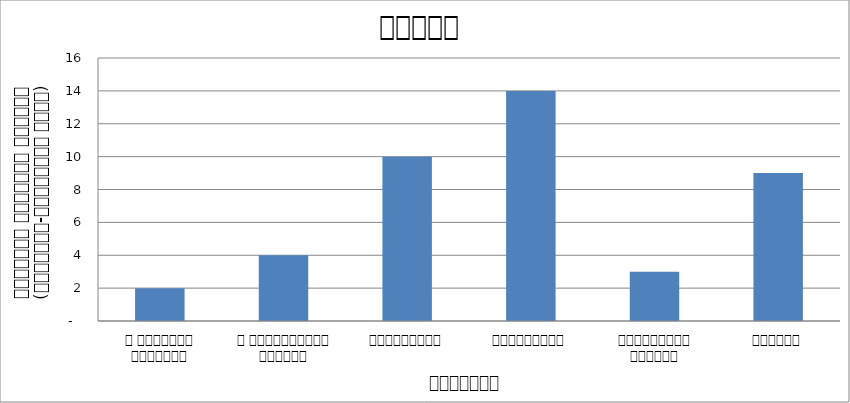
| Category | न्याय |
|---|---|
| द हिमालयन टाइम्स् | 2 |
| द काठमाण्डौं पोस्ट् | 4 |
| रिपब्लिका | 10 |
| कान्तिपुर | 14 |
| अन्नपूर्ण पोस्ट् | 3 |
| नागरिक | 9 |